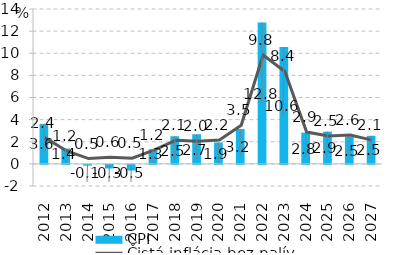
| Category | CPI |
|---|---|
| 2012.0 | 3.615 |
| 2013.0 | 1.389 |
| 2014.0 | -0.069 |
| 2015.0 | -0.326 |
| 2016.0 | -0.514 |
| 2017.0 | 1.313 |
| 2018.0 | 2.497 |
| 2019.0 | 2.677 |
| 2020.0 | 1.932 |
| 2021.0 | 3.156 |
| 2022.0 | 12.769 |
| 2023.0 | 10.568 |
| 2024.0 | 2.827 |
| 2025.0 | 2.916 |
| 2026.0 | 2.46 |
| 2027.0 | 2.539 |